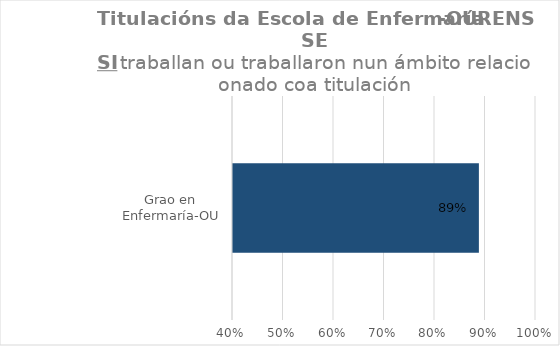
| Category | Series 1 |
|---|---|
| Grao en Enfermaría-OU | 0.889 |